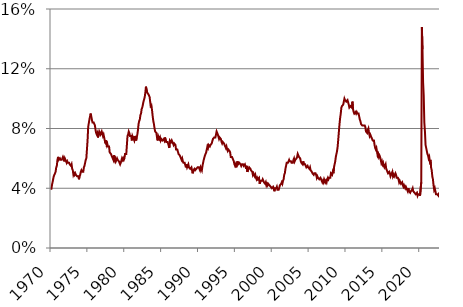
| Category | Series 0 |
|---|---|
| 1970.0 | 3.9 |
| 1970.0 | 4.2 |
| 1970.0 | 4.4 |
| 1970.0 | 4.6 |
| 1970.0 | 4.8 |
| 1970.0 | 4.9 |
| 1970.0 | 5 |
| 1970.0 | 5.1 |
| 1970.0 | 5.4 |
| 1970.0 | 5.5 |
| 1970.0 | 5.9 |
| 1970.0 | 6.1 |
| 1971.0 | 5.9 |
| 1971.0 | 5.9 |
| 1971.0 | 6 |
| 1971.0 | 5.9 |
| 1971.0 | 5.9 |
| 1971.0 | 5.9 |
| 1971.0 | 6 |
| 1971.0 | 6.1 |
| 1971.0 | 6 |
| 1971.0 | 5.8 |
| 1971.0 | 6 |
| 1971.0 | 6 |
| 1972.0 | 5.8 |
| 1972.0 | 5.7 |
| 1972.0 | 5.8 |
| 1972.0 | 5.7 |
| 1972.0 | 5.7 |
| 1972.0 | 5.7 |
| 1972.0 | 5.6 |
| 1972.0 | 5.6 |
| 1972.0 | 5.5 |
| 1972.0 | 5.6 |
| 1972.0 | 5.3 |
| 1972.0 | 5.2 |
| 1973.0 | 4.9 |
| 1973.0 | 5 |
| 1973.0 | 4.9 |
| 1973.0 | 5 |
| 1973.0 | 4.9 |
| 1973.0 | 4.9 |
| 1973.0 | 4.8 |
| 1973.0 | 4.8 |
| 1973.0 | 4.8 |
| 1973.0 | 4.6 |
| 1973.0 | 4.8 |
| 1973.0 | 4.9 |
| 1974.0 | 5.1 |
| 1974.0 | 5.2 |
| 1974.0 | 5.1 |
| 1974.0 | 5.1 |
| 1974.0 | 5.1 |
| 1974.0 | 5.4 |
| 1974.0 | 5.5 |
| 1974.0 | 5.5 |
| 1974.0 | 5.9 |
| 1974.0 | 6 |
| 1974.0 | 6.6 |
| 1974.0 | 7.2 |
| 1975.0 | 8.1 |
| 1975.0 | 8.1 |
| 1975.0 | 8.6 |
| 1975.0 | 8.8 |
| 1975.0 | 9 |
| 1975.0 | 8.8 |
| 1975.0 | 8.6 |
| 1975.0 | 8.4 |
| 1975.0 | 8.4 |
| 1975.0 | 8.4 |
| 1975.0 | 8.3 |
| 1975.0 | 8.2 |
| 1976.0 | 7.9 |
| 1976.0 | 7.7 |
| 1976.0 | 7.6 |
| 1976.0 | 7.7 |
| 1976.0 | 7.4 |
| 1976.0 | 7.6 |
| 1976.0 | 7.8 |
| 1976.0 | 7.8 |
| 1976.0 | 7.6 |
| 1976.0 | 7.7 |
| 1976.0 | 7.8 |
| 1976.0 | 7.8 |
| 1977.0 | 7.5 |
| 1977.0 | 7.6 |
| 1977.0 | 7.4 |
| 1977.0 | 7.2 |
| 1977.0 | 7 |
| 1977.0 | 7.2 |
| 1977.0 | 6.9 |
| 1977.0 | 7 |
| 1977.0 | 6.8 |
| 1977.0 | 6.8 |
| 1977.0 | 6.8 |
| 1977.0 | 6.4 |
| 1978.0 | 6.4 |
| 1978.0 | 6.3 |
| 1978.0 | 6.3 |
| 1978.0 | 6.1 |
| 1978.0 | 6 |
| 1978.0 | 5.9 |
| 1978.0 | 6.2 |
| 1978.0 | 5.9 |
| 1978.0 | 6 |
| 1978.0 | 5.8 |
| 1978.0 | 5.9 |
| 1978.0 | 6 |
| 1979.0 | 5.9 |
| 1979.0 | 5.9 |
| 1979.0 | 5.8 |
| 1979.0 | 5.8 |
| 1979.0 | 5.6 |
| 1979.0 | 5.7 |
| 1979.0 | 5.7 |
| 1979.0 | 6 |
| 1979.0 | 5.9 |
| 1979.0 | 6 |
| 1979.0 | 5.9 |
| 1979.0 | 6 |
| 1980.0 | 6.3 |
| 1980.0 | 6.3 |
| 1980.0 | 6.3 |
| 1980.0 | 6.9 |
| 1980.0 | 7.5 |
| 1980.0 | 7.6 |
| 1980.0 | 7.8 |
| 1980.0 | 7.7 |
| 1980.0 | 7.5 |
| 1980.0 | 7.5 |
| 1980.0 | 7.5 |
| 1980.0 | 7.2 |
| 1981.0 | 7.5 |
| 1981.0 | 7.4 |
| 1981.0 | 7.4 |
| 1981.0 | 7.2 |
| 1981.0 | 7.5 |
| 1981.0 | 7.5 |
| 1981.0 | 7.2 |
| 1981.0 | 7.4 |
| 1981.0 | 7.6 |
| 1981.0 | 7.9 |
| 1981.0 | 8.3 |
| 1981.0 | 8.5 |
| 1982.0 | 8.6 |
| 1982.0 | 8.9 |
| 1982.0 | 9 |
| 1982.0 | 9.3 |
| 1982.0 | 9.4 |
| 1982.0 | 9.6 |
| 1982.0 | 9.8 |
| 1982.0 | 9.8 |
| 1982.0 | 10.1 |
| 1982.0 | 10.4 |
| 1982.0 | 10.8 |
| 1982.0 | 10.8 |
| 1983.0 | 10.4 |
| 1983.0 | 10.4 |
| 1983.0 | 10.3 |
| 1983.0 | 10.2 |
| 1983.0 | 10.1 |
| 1983.0 | 10.1 |
| 1983.0 | 9.4 |
| 1983.0 | 9.5 |
| 1983.0 | 9.2 |
| 1983.0 | 8.8 |
| 1983.0 | 8.5 |
| 1983.0 | 8.3 |
| 1984.0 | 8 |
| 1984.0 | 7.8 |
| 1984.0 | 7.8 |
| 1984.0 | 7.7 |
| 1984.0 | 7.4 |
| 1984.0 | 7.2 |
| 1984.0 | 7.5 |
| 1984.0 | 7.5 |
| 1984.0 | 7.3 |
| 1984.0 | 7.4 |
| 1984.0 | 7.2 |
| 1984.0 | 7.3 |
| 1985.0 | 7.3 |
| 1985.0 | 7.2 |
| 1985.0 | 7.2 |
| 1985.0 | 7.3 |
| 1985.0 | 7.2 |
| 1985.0 | 7.4 |
| 1985.0 | 7.4 |
| 1985.0 | 7.1 |
| 1985.0 | 7.1 |
| 1985.0 | 7.1 |
| 1985.0 | 7 |
| 1985.0 | 7 |
| 1986.0 | 6.7 |
| 1986.0 | 7.2 |
| 1986.0 | 7.2 |
| 1986.0 | 7.1 |
| 1986.0 | 7.2 |
| 1986.0 | 7.2 |
| 1986.0 | 7 |
| 1986.0 | 6.9 |
| 1986.0 | 7 |
| 1986.0 | 7 |
| 1986.0 | 6.9 |
| 1986.0 | 6.6 |
| 1987.0 | 6.6 |
| 1987.0 | 6.6 |
| 1987.0 | 6.6 |
| 1987.0 | 6.3 |
| 1987.0 | 6.3 |
| 1987.0 | 6.2 |
| 1987.0 | 6.1 |
| 1987.0 | 6 |
| 1987.0 | 5.9 |
| 1987.0 | 6 |
| 1987.0 | 5.8 |
| 1987.0 | 5.7 |
| 1988.0 | 5.7 |
| 1988.0 | 5.7 |
| 1988.0 | 5.7 |
| 1988.0 | 5.4 |
| 1988.0 | 5.6 |
| 1988.0 | 5.4 |
| 1988.0 | 5.4 |
| 1988.0 | 5.6 |
| 1988.0 | 5.4 |
| 1988.0 | 5.4 |
| 1988.0 | 5.3 |
| 1988.0 | 5.3 |
| 1989.0 | 5.4 |
| 1989.0 | 5.2 |
| 1989.0 | 5 |
| 1989.0 | 5.2 |
| 1989.0 | 5.2 |
| 1989.0 | 5.3 |
| 1989.0 | 5.2 |
| 1989.0 | 5.2 |
| 1989.0 | 5.3 |
| 1989.0 | 5.3 |
| 1989.0 | 5.4 |
| 1989.0 | 5.4 |
| 1990.0 | 5.4 |
| 1990.0 | 5.3 |
| 1990.0 | 5.2 |
| 1990.0 | 5.4 |
| 1990.0 | 5.4 |
| 1990.0 | 5.2 |
| 1990.0 | 5.5 |
| 1990.0 | 5.7 |
| 1990.0 | 5.9 |
| 1990.0 | 5.9 |
| 1990.0 | 6.2 |
| 1990.0 | 6.3 |
| 1991.0 | 6.4 |
| 1991.0 | 6.6 |
| 1991.0 | 6.8 |
| 1991.0 | 6.7 |
| 1991.0 | 6.9 |
| 1991.0 | 6.9 |
| 1991.0 | 6.8 |
| 1991.0 | 6.9 |
| 1991.0 | 6.9 |
| 1991.0 | 7 |
| 1991.0 | 7 |
| 1991.0 | 7.3 |
| 1992.0 | 7.3 |
| 1992.0 | 7.4 |
| 1992.0 | 7.4 |
| 1992.0 | 7.4 |
| 1992.0 | 7.6 |
| 1992.0 | 7.8 |
| 1992.0 | 7.7 |
| 1992.0 | 7.6 |
| 1992.0 | 7.6 |
| 1992.0 | 7.3 |
| 1992.0 | 7.4 |
| 1992.0 | 7.4 |
| 1993.0 | 7.3 |
| 1993.0 | 7.1 |
| 1993.0 | 7 |
| 1993.0 | 7.1 |
| 1993.0 | 7.1 |
| 1993.0 | 7 |
| 1993.0 | 6.9 |
| 1993.0 | 6.8 |
| 1993.0 | 6.7 |
| 1993.0 | 6.8 |
| 1993.0 | 6.6 |
| 1993.0 | 6.5 |
| 1994.0 | 6.6 |
| 1994.0 | 6.6 |
| 1994.0 | 6.5 |
| 1994.0 | 6.4 |
| 1994.0 | 6.1 |
| 1994.0 | 6.1 |
| 1994.0 | 6.1 |
| 1994.0 | 6 |
| 1994.0 | 5.9 |
| 1994.0 | 5.8 |
| 1994.0 | 5.6 |
| 1994.0 | 5.5 |
| 1995.0 | 5.6 |
| 1995.0 | 5.4 |
| 1995.0 | 5.4 |
| 1995.0 | 5.8 |
| 1995.0 | 5.6 |
| 1995.0 | 5.6 |
| 1995.0 | 5.7 |
| 1995.0 | 5.7 |
| 1995.0 | 5.6 |
| 1995.0 | 5.5 |
| 1995.0 | 5.6 |
| 1995.0 | 5.6 |
| 1996.0 | 5.6 |
| 1996.0 | 5.5 |
| 1996.0 | 5.5 |
| 1996.0 | 5.6 |
| 1996.0 | 5.6 |
| 1996.0 | 5.3 |
| 1996.0 | 5.5 |
| 1996.0 | 5.1 |
| 1996.0 | 5.2 |
| 1996.0 | 5.2 |
| 1996.0 | 5.4 |
| 1996.0 | 5.4 |
| 1997.0 | 5.3 |
| 1997.0 | 5.2 |
| 1997.0 | 5.2 |
| 1997.0 | 5.1 |
| 1997.0 | 4.9 |
| 1997.0 | 5 |
| 1997.0 | 4.9 |
| 1997.0 | 4.8 |
| 1997.0 | 4.9 |
| 1997.0 | 4.7 |
| 1997.0 | 4.6 |
| 1997.0 | 4.7 |
| 1998.0 | 4.6 |
| 1998.0 | 4.6 |
| 1998.0 | 4.7 |
| 1998.0 | 4.3 |
| 1998.0 | 4.4 |
| 1998.0 | 4.5 |
| 1998.0 | 4.5 |
| 1998.0 | 4.5 |
| 1998.0 | 4.6 |
| 1998.0 | 4.5 |
| 1998.0 | 4.4 |
| 1998.0 | 4.4 |
| 1999.0 | 4.3 |
| 1999.0 | 4.4 |
| 1999.0 | 4.2 |
| 1999.0 | 4.3 |
| 1999.0 | 4.2 |
| 1999.0 | 4.3 |
| 1999.0 | 4.3 |
| 1999.0 | 4.2 |
| 1999.0 | 4.2 |
| 1999.0 | 4.1 |
| 1999.0 | 4.1 |
| 1999.0 | 4 |
| 2000.0 | 4 |
| 2000.0 | 4.1 |
| 2000.0 | 4 |
| 2000.0 | 3.8 |
| 2000.0 | 4 |
| 2000.0 | 4 |
| 2000.0 | 4 |
| 2000.0 | 4.1 |
| 2000.0 | 3.9 |
| 2000.0 | 3.9 |
| 2000.0 | 3.9 |
| 2000.0 | 3.9 |
| 2001.0 | 4.2 |
| 2001.0 | 4.2 |
| 2001.0 | 4.3 |
| 2001.0 | 4.4 |
| 2001.0 | 4.3 |
| 2001.0 | 4.5 |
| 2001.0 | 4.6 |
| 2001.0 | 4.9 |
| 2001.0 | 5 |
| 2001.0 | 5.3 |
| 2001.0 | 5.5 |
| 2001.0 | 5.7 |
| 2002.0 | 5.7 |
| 2002.0 | 5.7 |
| 2002.0 | 5.7 |
| 2002.0 | 5.9 |
| 2002.0 | 5.8 |
| 2002.0 | 5.8 |
| 2002.0 | 5.8 |
| 2002.0 | 5.7 |
| 2002.0 | 5.7 |
| 2002.0 | 5.7 |
| 2002.0 | 5.9 |
| 2002.0 | 6 |
| 2003.0 | 5.8 |
| 2003.0 | 5.9 |
| 2003.0 | 5.9 |
| 2003.0 | 6 |
| 2003.0 | 6.1 |
| 2003.0 | 6.3 |
| 2003.0 | 6.2 |
| 2003.0 | 6.1 |
| 2003.0 | 6.1 |
| 2003.0 | 6 |
| 2003.0 | 5.8 |
| 2003.0 | 5.7 |
| 2004.0 | 5.7 |
| 2004.0 | 5.6 |
| 2004.0 | 5.8 |
| 2004.0 | 5.6 |
| 2004.0 | 5.6 |
| 2004.0 | 5.6 |
| 2004.0 | 5.5 |
| 2004.0 | 5.4 |
| 2004.0 | 5.4 |
| 2004.0 | 5.5 |
| 2004.0 | 5.4 |
| 2004.0 | 5.4 |
| 2005.0 | 5.3 |
| 2005.0 | 5.4 |
| 2005.0 | 5.2 |
| 2005.0 | 5.2 |
| 2005.0 | 5.1 |
| 2005.0 | 5 |
| 2005.0 | 5 |
| 2005.0 | 4.9 |
| 2005.0 | 5 |
| 2005.0 | 5 |
| 2005.0 | 5 |
| 2005.0 | 4.9 |
| 2006.0 | 4.7 |
| 2006.0 | 4.8 |
| 2006.0 | 4.7 |
| 2006.0 | 4.7 |
| 2006.0 | 4.6 |
| 2006.0 | 4.6 |
| 2006.0 | 4.7 |
| 2006.0 | 4.7 |
| 2006.0 | 4.5 |
| 2006.0 | 4.4 |
| 2006.0 | 4.5 |
| 2006.0 | 4.4 |
| 2007.0 | 4.6 |
| 2007.0 | 4.5 |
| 2007.0 | 4.4 |
| 2007.0 | 4.5 |
| 2007.0 | 4.4 |
| 2007.0 | 4.6 |
| 2007.0 | 4.7 |
| 2007.0 | 4.6 |
| 2007.0 | 4.7 |
| 2007.0 | 4.7 |
| 2007.0 | 4.7 |
| 2007.0 | 5 |
| 2008.0 | 5 |
| 2008.0 | 4.9 |
| 2008.0 | 5.1 |
| 2008.0 | 5 |
| 2008.0 | 5.4 |
| 2008.0 | 5.6 |
| 2008.0 | 5.8 |
| 2008.0 | 6.1 |
| 2008.0 | 6.1 |
| 2008.0 | 6.5 |
| 2008.0 | 6.8 |
| 2008.0 | 7.3 |
| 2009.0 | 7.8 |
| 2009.0 | 8.3 |
| 2009.0 | 8.7 |
| 2009.0 | 9 |
| 2009.0 | 9.4 |
| 2009.0 | 9.5 |
| 2009.0 | 9.5 |
| 2009.0 | 9.6 |
| 2009.0 | 9.8 |
| 2009.0 | 10 |
| 2009.0 | 9.9 |
| 2009.0 | 9.9 |
| 2010.0 | 9.8 |
| 2010.0 | 9.8 |
| 2010.0 | 9.9 |
| 2010.0 | 9.9 |
| 2010.0 | 9.6 |
| 2010.0 | 9.4 |
| 2010.0 | 9.4 |
| 2010.0 | 9.5 |
| 2010.0 | 9.5 |
| 2010.0 | 9.4 |
| 2010.0 | 9.8 |
| 2010.0 | 9.3 |
| 2011.0 | 9.1 |
| 2011.0 | 9 |
| 2011.0 | 9 |
| 2011.0 | 9.1 |
| 2011.0 | 9 |
| 2011.0 | 9.1 |
| 2011.0 | 9 |
| 2011.0 | 9 |
| 2011.0 | 9 |
| 2011.0 | 8.8 |
| 2011.0 | 8.6 |
| 2011.0 | 8.5 |
| 2012.0 | 8.3 |
| 2012.0 | 8.3 |
| 2012.0 | 8.2 |
| 2012.0 | 8.2 |
| 2012.0 | 8.2 |
| 2012.0 | 8.2 |
| 2012.0 | 8.2 |
| 2012.0 | 8.1 |
| 2012.0 | 7.8 |
| 2012.0 | 7.8 |
| 2012.0 | 7.7 |
| 2012.0 | 7.9 |
| 2013.0 | 8 |
| 2013.0 | 7.7 |
| 2013.0 | 7.5 |
| 2013.0 | 7.6 |
| 2013.0 | 7.5 |
| 2013.0 | 7.5 |
| 2013.0 | 7.3 |
| 2013.0 | 7.2 |
| 2013.0 | 7.2 |
| 2013.0 | 7.2 |
| 2013.0 | 6.9 |
| 2013.0 | 6.7 |
| 2014.0 | 6.6 |
| 2014.0 | 6.7 |
| 2014.0 | 6.7 |
| 2014.0 | 6.2 |
| 2014.0 | 6.3 |
| 2014.0 | 6.1 |
| 2014.0 | 6.2 |
| 2014.0 | 6.1 |
| 2014.0 | 5.9 |
| 2014.0 | 5.7 |
| 2014.0 | 5.8 |
| 2014.0 | 5.6 |
| 2015.0 | 5.7 |
| 2015.0 | 5.5 |
| 2015.0 | 5.4 |
| 2015.0 | 5.4 |
| 2015.0 | 5.6 |
| 2015.0 | 5.3 |
| 2015.0 | 5.2 |
| 2015.0 | 5.1 |
| 2015.0 | 5 |
| 2015.0 | 5 |
| 2015.0 | 5.1 |
| 2015.0 | 5 |
| 2016.0 | 4.8 |
| 2016.0 | 4.9 |
| 2016.0 | 5 |
| 2016.0 | 5.1 |
| 2016.0 | 4.8 |
| 2016.0 | 4.9 |
| 2016.0 | 4.8 |
| 2016.0 | 4.9 |
| 2016.0 | 5 |
| 2016.0 | 4.9 |
| 2016.0 | 4.7 |
| 2016.0 | 4.7 |
| 2017.0 | 4.7 |
| 2017.0 | 4.6 |
| 2017.0 | 4.4 |
| 2017.0 | 4.5 |
| 2017.0 | 4.4 |
| 2017.0 | 4.3 |
| 2017.0 | 4.3 |
| 2017.0 | 4.4 |
| 2017.0 | 4.2 |
| 2017.0 | 4.1 |
| 2017.0 | 4.2 |
| 2017.0 | 4.1 |
| 2018.0 | 4 |
| 2018.0 | 4.1 |
| 2018.0 | 4 |
| 2018.0 | 4 |
| 2018.0 | 3.8 |
| 2018.0 | 4 |
| 2018.0 | 3.8 |
| 2018.0 | 3.8 |
| 2018.0 | 3.7 |
| 2018.0 | 3.8 |
| 2018.0 | 3.8 |
| 2018.0 | 3.9 |
| 2019.0 | 4 |
| 2019.0 | 3.8 |
| 2019.0 | 3.8 |
| 2019.0 | 3.7 |
| 2019.0 | 3.7 |
| 2019.0 | 3.6 |
| 2019.0 | 3.6 |
| 2019.0 | 3.7 |
| 2019.0 | 3.5 |
| 2019.0 | 3.6 |
| 2019.0 | 3.6 |
| 2019.0 | 3.6 |
| 2020.0 | 3.5 |
| 2020.0 | 3.5 |
| 2020.0 | 4.4 |
| 2020.0 | 14.8 |
| 2020.0 | 13.3 |
| 2020.0 | 11.1 |
| 2020.0 | 10.2 |
| 2020.0 | 8.4 |
| 2020.0 | 7.8 |
| 2020.0 | 6.9 |
| 2020.0 | 6.7 |
| 2020.0 | 6.7 |
| 2021.0 | 6.3 |
| 2021.0 | 6.2 |
| 2021.0 | 6 |
| 2021.0 | 6.1 |
| 2021.0 | 5.8 |
| 2021.0 | 5.9 |
| 2021.0 | 5.4 |
| 2021.0 | 5.2 |
| 2021.0 | 4.8 |
| 2021.0 | 4.6 |
| 2021.0 | 4.2 |
| 2021.0 | 3.9 |
| 2022.0 | 4 |
| 2022.0 | 3.8 |
| 2022.0 | 3.6 |
| 2022.0 | 3.6 |
| 2022.0 | 3.6 |
| 2022.0 | 3.6 |
| 2022.0 | 3.5 |
| 2022.0 | 3.7 |
| 2022.0 | 3.5 |